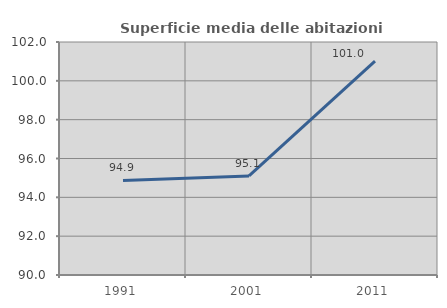
| Category | Superficie media delle abitazioni occupate |
|---|---|
| 1991.0 | 94.868 |
| 2001.0 | 95.105 |
| 2011.0 | 101.018 |